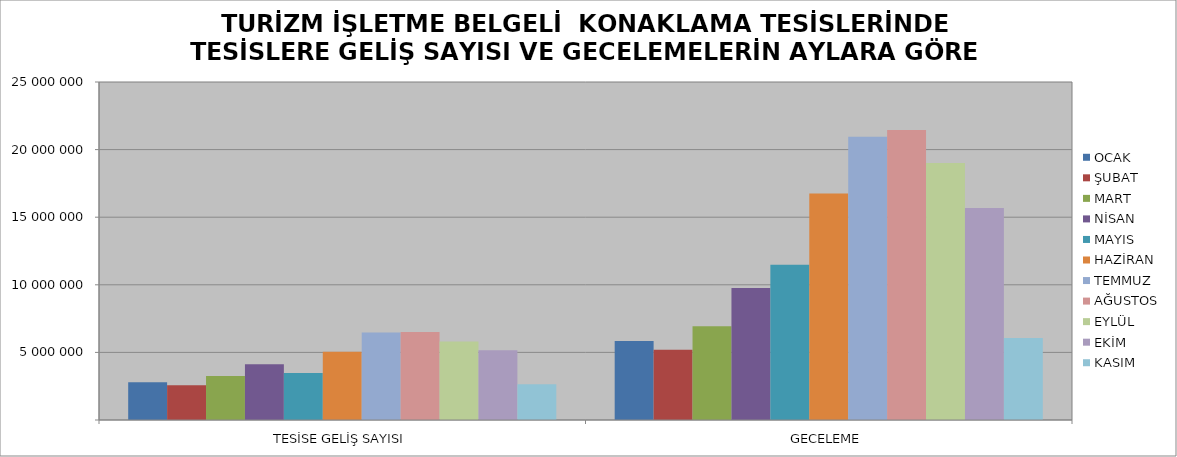
| Category | OCAK | ŞUBAT | MART | NİSAN | MAYIS | HAZİRAN | TEMMUZ | AĞUSTOS | EYLÜL | EKİM | KASIM |
|---|---|---|---|---|---|---|---|---|---|---|---|
| TESİSE GELİŞ SAYISI | 2792196 | 2573999 | 3258929 | 4119434 | 3468117 | 5043280 | 6471045 | 6513976 | 5800131 | 5161194 | 2643256 |
| GECELEME | 5837753 | 5199578 | 6939659 | 9767435 | 11484758 | 16745602 | 20944829 | 21446796 | 19007595 | 15688416 | 6060223 |